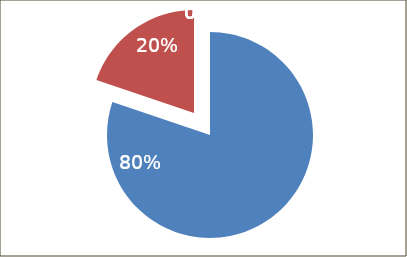
| Category | Series 0 |
|---|---|
| RECURSOS PROPIOS | 234854187 |
| APORTACIONES FEDERALES | 58088980 |
| PROGRAMAS FEDERALES | 0 |
| PROGRAMAS ESTATALES | 0 |
| OTROS | 0 |